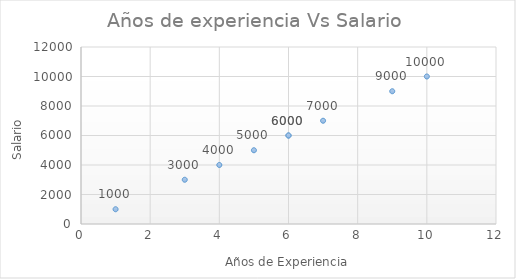
| Category | Series 0 |
|---|---|
| 5.0 | 5000 |
| 4.0 | 4000 |
| 6.0 | 6000 |
| 3.0 | 3000 |
| 7.0 | 7000 |
| 1.0 | 1000 |
| 10.0 | 10000 |
| 6.0 | 6000 |
| 9.0 | 9000 |